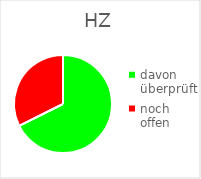
| Category | HZ |
|---|---|
| davon überprüft | 393 |
| noch offen | 188 |